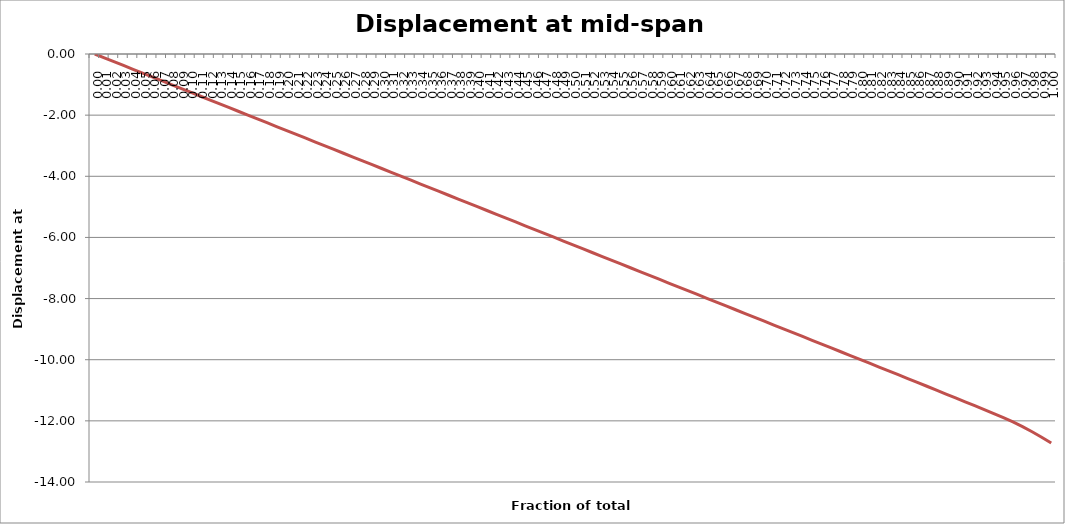
| Category | Displacement at mid-span [mm] |
|---|---|
| 0.0 | 0 |
| 0.01 | -0.125 |
| 0.02 | -0.25 |
| 0.03 | -0.375 |
| 0.04 | -0.499 |
| 0.05 | -0.624 |
| 0.06 | -0.749 |
| 0.06999999999999999 | -0.874 |
| 0.08 | -0.999 |
| 0.09 | -1.124 |
| 0.1 | -1.249 |
| 0.11000000000000001 | -1.374 |
| 0.12 | -1.498 |
| 0.13 | -1.623 |
| 0.13999999999999999 | -1.748 |
| 0.15 | -1.873 |
| 0.16 | -1.998 |
| 0.16999999999999998 | -2.123 |
| 0.18 | -2.248 |
| 0.19 | -2.372 |
| 0.2 | -2.497 |
| 0.21000000000000002 | -2.622 |
| 0.22000000000000003 | -2.747 |
| 0.22999999999999998 | -2.872 |
| 0.24 | -2.997 |
| 0.25 | -3.122 |
| 0.26 | -3.246 |
| 0.27 | -3.371 |
| 0.27999999999999997 | -3.496 |
| 0.29 | -3.621 |
| 0.3 | -3.746 |
| 0.31 | -3.871 |
| 0.32 | -3.996 |
| 0.32999999999999996 | -4.12 |
| 0.33999999999999997 | -4.245 |
| 0.35 | -4.37 |
| 0.36 | -4.495 |
| 0.37 | -4.62 |
| 0.38 | -4.745 |
| 0.39 | -4.87 |
| 0.4 | -4.994 |
| 0.41 | -5.119 |
| 0.42000000000000004 | -5.244 |
| 0.43 | -5.369 |
| 0.44000000000000006 | -5.494 |
| 0.45 | -5.619 |
| 0.45999999999999996 | -5.744 |
| 0.47000000000000003 | -5.868 |
| 0.48 | -5.993 |
| 0.49000000000000005 | -6.118 |
| 0.5 | -6.243 |
| 0.51 | -6.368 |
| 0.52 | -6.493 |
| 0.53 | -6.618 |
| 0.54 | -6.742 |
| 0.55 | -6.867 |
| 0.5599999999999999 | -6.992 |
| 0.5700000000000001 | -7.117 |
| 0.58 | -7.242 |
| 0.5900000000000001 | -7.367 |
| 0.6 | -7.492 |
| 0.61 | -7.616 |
| 0.62 | -7.741 |
| 0.63 | -7.866 |
| 0.64 | -7.991 |
| 0.65 | -8.116 |
| 0.6599999999999999 | -8.241 |
| 0.67 | -8.366 |
| 0.6799999999999999 | -8.49 |
| 0.6900000000000001 | -8.615 |
| 0.7 | -8.74 |
| 0.71 | -8.865 |
| 0.72 | -8.99 |
| 0.73 | -9.115 |
| 0.74 | -9.24 |
| 0.75 | -9.365 |
| 0.76 | -9.49 |
| 0.77 | -9.614 |
| 0.78 | -9.74 |
| 0.79 | -9.864 |
| 0.8 | -9.99 |
| 0.8099999999999999 | -10.115 |
| 0.82 | -10.24 |
| 0.8300000000000001 | -10.365 |
| 0.8400000000000001 | -10.491 |
| 0.85 | -10.616 |
| 0.86 | -10.742 |
| 0.8699999999999999 | -10.868 |
| 0.8800000000000001 | -10.995 |
| 0.89 | -11.122 |
| 0.9 | -11.249 |
| 0.9099999999999999 | -11.377 |
| 0.9199999999999999 | -11.505 |
| 0.93 | -11.634 |
| 0.9400000000000001 | -11.765 |
| 0.95 | -11.897 |
| 0.96 | -12.036 |
| 0.97 | -12.188 |
| 0.9800000000000001 | -12.357 |
| 0.99 | -12.534 |
| 1.0 | -12.725 |